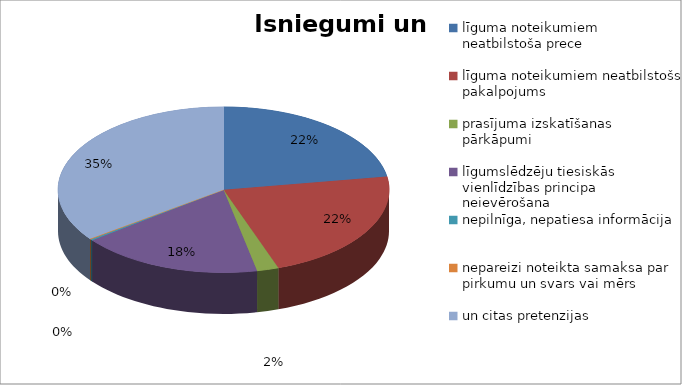
| Category | Series 0 |
|---|---|
| līguma noteikumiem neatbilstoša prece | 487 |
| līguma noteikumiem neatbilstošs pakalpojums | 482 |
| prasījuma izskatīšanas pārkāpumi | 46 |
| līgumslēdzēju tiesiskās vienlīdzības principa neievērošana | 386 |
| nepilnīga, nepatiesa informācija | 5 |
| nepareizi noteikta samaksa par pirkumu un svars vai mērs | 3 |
| un citas pretenzijas | 762 |